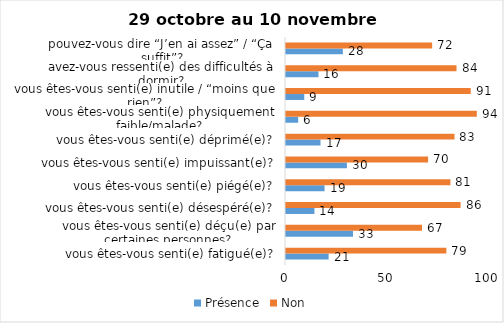
| Category | Présence | Non |
|---|---|---|
| vous êtes-vous senti(e) fatigué(e)? | 21 | 79 |
| vous êtes-vous senti(e) déçu(e) par certaines personnes? | 33 | 67 |
| vous êtes-vous senti(e) désespéré(e)? | 14 | 86 |
| vous êtes-vous senti(e) piégé(e)? | 19 | 81 |
| vous êtes-vous senti(e) impuissant(e)? | 30 | 70 |
| vous êtes-vous senti(e) déprimé(e)? | 17 | 83 |
| vous êtes-vous senti(e) physiquement faible/malade? | 6 | 94 |
| vous êtes-vous senti(e) inutile / “moins que rien”? | 9 | 91 |
| avez-vous ressenti(e) des difficultés à dormir? | 16 | 84 |
| pouvez-vous dire “J’en ai assez” / “Ça suffit”? | 28 | 72 |